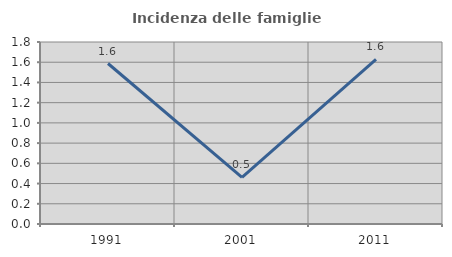
| Category | Incidenza delle famiglie numerose |
|---|---|
| 1991.0 | 1.587 |
| 2001.0 | 0.462 |
| 2011.0 | 1.629 |